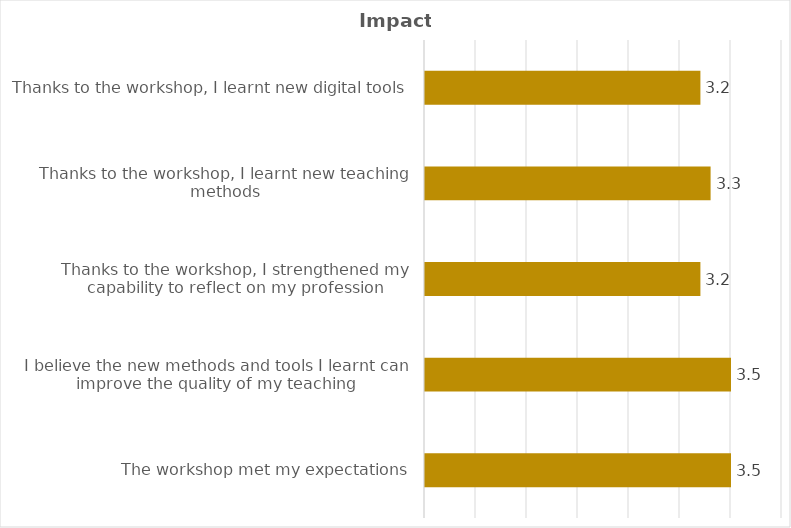
| Category | Series 0 |
|---|---|
| The workshop met my expectations | 3.5 |
| I believe the new methods and tools I learnt can improve the quality of my teaching | 3.5 |
| Thanks to the workshop, I strengthened my capability to reflect on my profession | 3.2 |
| Thanks to the workshop, I learnt new teaching methods | 3.3 |
| Thanks to the workshop, I learnt new digital tools | 3.2 |